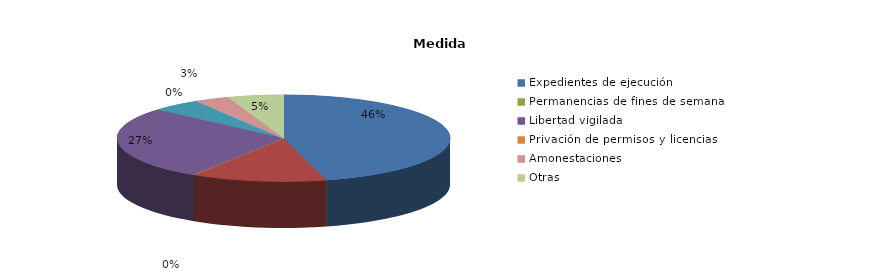
| Category | Series 0 |
|---|---|
| Expedientes de ejecución | 254 |
| Internamientos | 73 |
| Permanencias de fines de semana | 0 |
| Libertad vigilada | 152 |
| Prestaciones en beneficio de la comunidad | 27 |
| Privación de permisos y licencias | 0 |
| Convivencia Familiar Educativa | 0 |
| Amonestaciones | 18 |
| Otras | 30 |